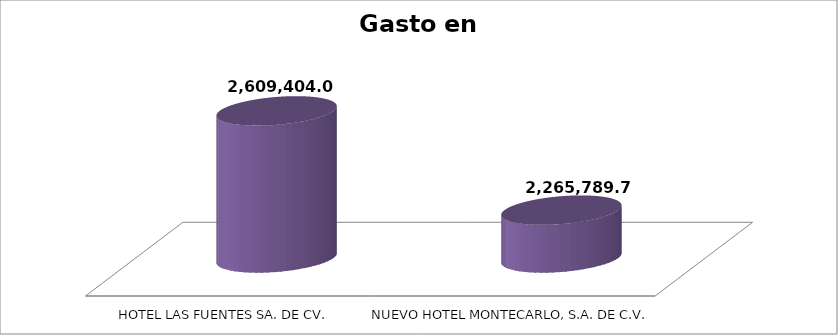
| Category | SUMA |
|---|---|
| HOTEL LAS FUENTES SA. DE CV. | 2609404 |
| NUEVO HOTEL MONTECARLO, S.A. DE C.V. | 2265789.75 |